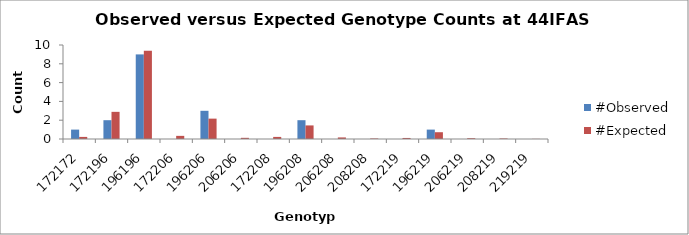
| Category | #Observed | #Expected |
|---|---|---|
| 172172.0 | 1 | 0.222 |
| 172196.0 | 2 | 2.889 |
| 196196.0 | 9 | 9.389 |
| 172206.0 | 0 | 0.333 |
| 196206.0 | 3 | 2.167 |
| 206206.0 | 0 | 0.125 |
| 172208.0 | 0 | 0.222 |
| 196208.0 | 2 | 1.444 |
| 206208.0 | 0 | 0.167 |
| 208208.0 | 0 | 0.056 |
| 172219.0 | 0 | 0.111 |
| 196219.0 | 1 | 0.722 |
| 206219.0 | 0 | 0.083 |
| 208219.0 | 0 | 0.056 |
| 219219.0 | 0 | 0.014 |